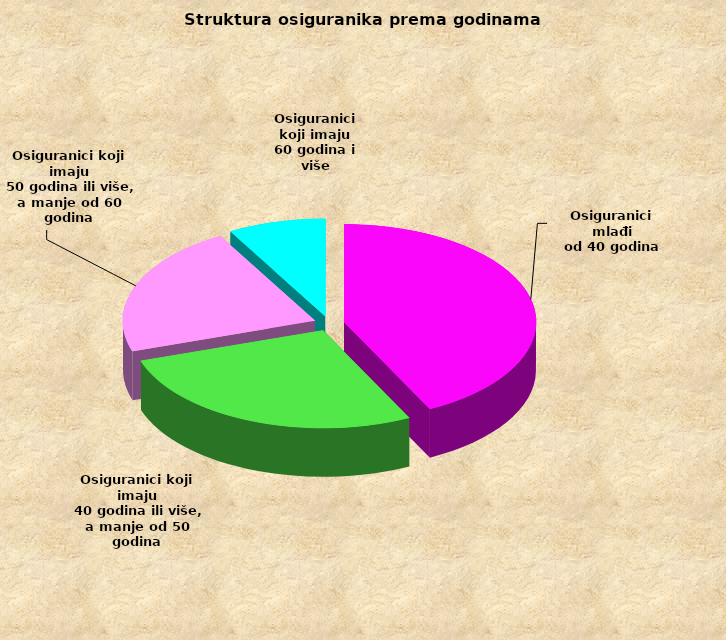
| Category | Series 0 |
|---|---|
| Osiguranici mlađi
od 40 godina | 720779 |
| Osiguranici koji imaju
 40 godina ili više, a manje od 50 godina | 462209 |
| Osiguranici koji imaju
 50 godina ili više, a manje od 60 godina | 369593 |
| Osiguranici koji imaju
60 godina i više | 138985 |